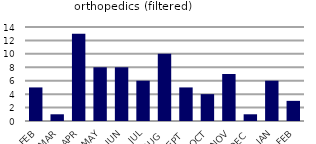
| Category | orthopedics (filtered) |
|---|---|
| FEB | 5 |
| MAR | 1 |
| APR | 13 |
| MAY | 8 |
| JUN | 8 |
| JUL | 6 |
| AUG | 10 |
| SEPT | 5 |
| OCT | 4 |
| NOV | 7 |
| DEC | 1 |
| JAN | 6 |
| FEB | 3 |